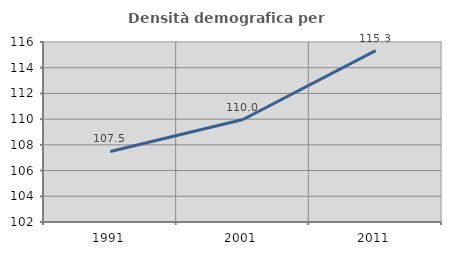
| Category | Densità demografica |
|---|---|
| 1991.0 | 107.483 |
| 2001.0 | 109.972 |
| 2011.0 | 115.329 |